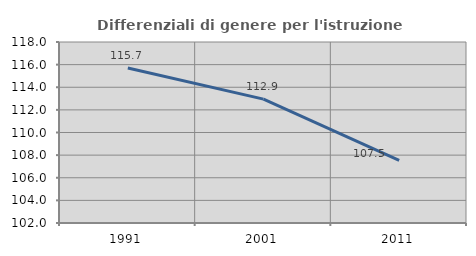
| Category | Differenziali di genere per l'istruzione superiore |
|---|---|
| 1991.0 | 115.696 |
| 2001.0 | 112.948 |
| 2011.0 | 107.546 |